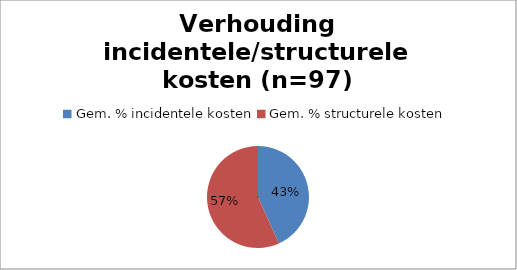
| Category | Series 0 |
|---|---|
| Gem. % incidentele kosten | 43.268 |
| Gem. % structurele kosten | 56.732 |